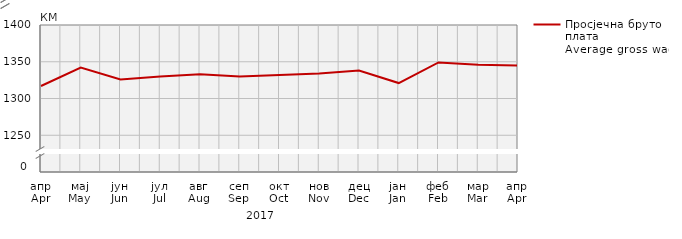
| Category | Просјечна бруто плата
Average gross wage |
|---|---|
| апр
Apr | 1317 |
| мај
May | 1342 |
| јун
Jun | 1326 |
| јул
Jul | 1330 |
| авг
Aug | 1333 |
| сеп
Sep | 1330 |
| окт
Oct | 1332 |
| нов
Nov | 1334 |
| дец
Dec | 1338 |
| јан
Jan | 1321 |
| феб
Feb | 1349 |
| мар
Mar | 1346 |
| апр
Apr | 1345 |